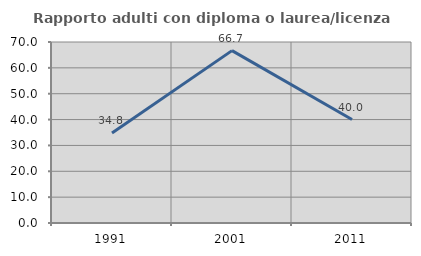
| Category | Rapporto adulti con diploma o laurea/licenza media  |
|---|---|
| 1991.0 | 34.783 |
| 2001.0 | 66.667 |
| 2011.0 | 40 |